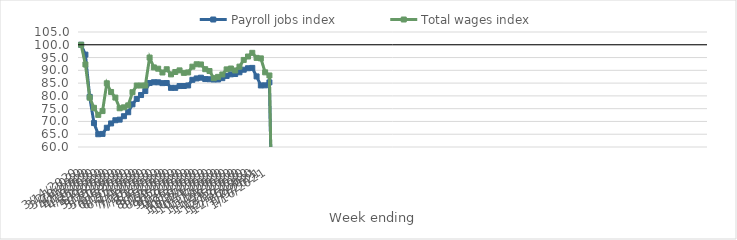
| Category | Payroll jobs index | Total wages index |
|---|---|---|
| 14/03/2020 | 100 | 100 |
| 21/03/2020 | 96.151 | 92.295 |
| 28/03/2020 | 79.616 | 79.305 |
| 04/04/2020 | 69.364 | 75.332 |
| 11/04/2020 | 64.99 | 72.559 |
| 18/04/2020 | 65.125 | 74.059 |
| 25/04/2020 | 67.529 | 84.927 |
| 02/05/2020 | 69.217 | 81.531 |
| 09/05/2020 | 70.467 | 79.337 |
| 16/05/2020 | 70.711 | 75.162 |
| 23/05/2020 | 72.046 | 75.518 |
| 30/05/2020 | 73.601 | 76.288 |
| 06/06/2020 | 76.707 | 81.437 |
| 13/06/2020 | 78.799 | 84.059 |
| 20/06/2020 | 80.334 | 84.06 |
| 27/06/2020 | 81.897 | 84.06 |
| 04/07/2020 | 85.035 | 94.999 |
| 11/07/2020 | 85.337 | 91.143 |
| 18/07/2020 | 85.309 | 90.639 |
| 25/07/2020 | 84.99 | 89.155 |
| 01/08/2020 | 85.046 | 90.428 |
| 08/08/2020 | 83.148 | 88.418 |
| 15/08/2020 | 83.152 | 89.35 |
| 22/08/2020 | 83.855 | 89.984 |
| 29/08/2020 | 83.864 | 89.009 |
| 05/09/2020 | 84.09 | 89.181 |
| 12/09/2020 | 86.282 | 91.429 |
| 19/09/2020 | 86.829 | 92.379 |
| 26/09/2020 | 87.121 | 92.296 |
| 03/10/2020 | 86.587 | 90.444 |
| 10/10/2020 | 86.512 | 89.729 |
| 17/10/2020 | 86.398 | 86.94 |
| 24/10/2020 | 86.43 | 87.442 |
| 31/10/2020 | 86.944 | 88.379 |
| 07/11/2020 | 87.806 | 90.374 |
| 14/11/2020 | 88.432 | 90.707 |
| 21/11/2020 | 88.557 | 89.95 |
| 28/11/2020 | 89.237 | 91.448 |
| 05/12/2020 | 90.236 | 94.065 |
| 12/12/2020 | 90.821 | 95.412 |
| 19/12/2020 | 90.951 | 96.846 |
| 26/12/2020 | 87.618 | 94.876 |
| 02/01/2021 | 84.081 | 94.679 |
| 09/01/2021 | 84.129 | 89.218 |
| 16/01/2021 | 85.286 | 87.991 |